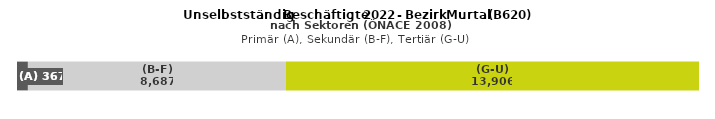
| Category | (A) | (B-F) | (G-U) |
|---|---|---|---|
| 0 | 367 | 8687 | 13906 |